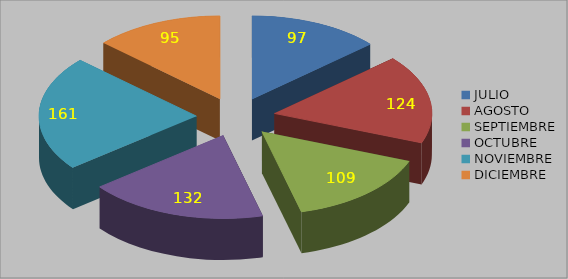
| Category | Series 0 |
|---|---|
| JULIO | 97 |
| AGOSTO | 124 |
| SEPTIEMBRE | 109 |
| OCTUBRE | 132 |
| NOVIEMBRE | 161 |
| DICIEMBRE | 95 |